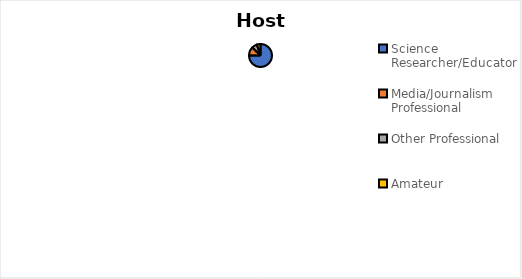
| Category | Series 0 |
|---|---|
| Science Researcher/Educator | 621 |
| Media/Journalism Professional | 102 |
| Other Professional | 62 |
| Amateur | 43 |